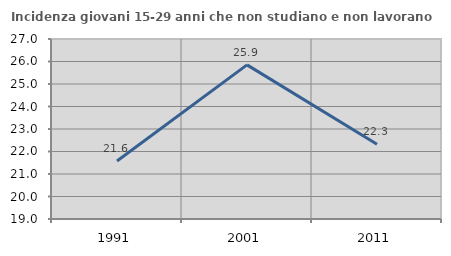
| Category | Incidenza giovani 15-29 anni che non studiano e non lavorano  |
|---|---|
| 1991.0 | 21.579 |
| 2001.0 | 25.85 |
| 2011.0 | 22.321 |